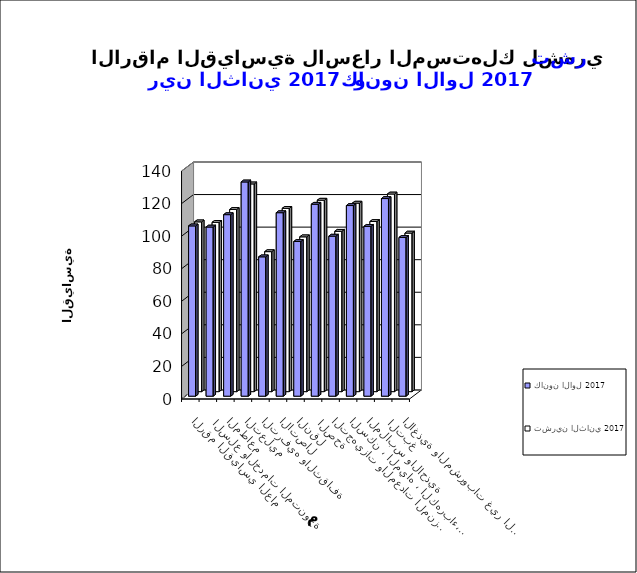
| Category | كانون الاول 2017      | تشرين الثاني 2017       |
|---|---|---|
| الاغذية والمشروبات غير الكحولية | 97.5 | 97.4 |
|  التبغ | 121.4 | 121.4 |
| الملابس والاحذية | 104.3 | 104.5 |
| السكن ، المياه ، الكهرباء، الغاز  | 117.1 | 115.8 |
| التجهيزات والمعدات المنزلية والصيانة | 98.3 | 98.5 |
|  الصحة | 117.9 | 117.6 |
| النقل | 95 | 95.1 |
| الاتصال | 112.7 | 112.6 |
| الترفيه والثقافة | 85.6 | 86 |
| التعليم | 131.6 | 127.6 |
| المطاعم  | 111.5 | 111.9 |
|  السلع والخدمات المتنوعة | 103.9 | 104 |
| الرقم القياسي العام | 104.6 | 104.3 |